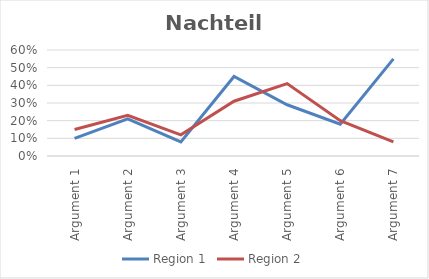
| Category | Region 1 | Region 2 |
|---|---|---|
| Argument 1 | 0.1 | 0.15 |
| Argument 2 | 0.21 | 0.23 |
| Argument 3 | 0.08 | 0.12 |
| Argument 4 | 0.45 | 0.31 |
| Argument 5 | 0.29 | 0.41 |
| Argument 6 | 0.18 | 0.2 |
| Argument 7 | 0.55 | 0.08 |